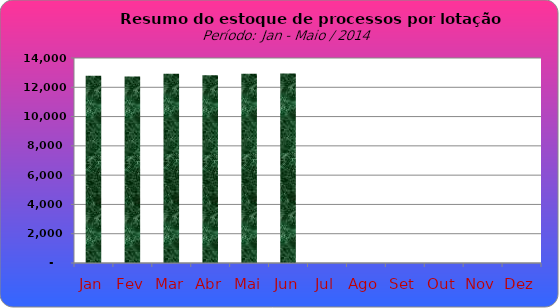
| Category | Series 0 |
|---|---|
| Jan | 12795 |
| Fev | 12744 |
| Mar | 12928 |
| Abr | 12816 |
| Mai | 12923 |
| Jun | 12943 |
| Jul | 0 |
| Ago | 0 |
| Set | 0 |
| Out | 0 |
| Nov | 0 |
| Dez | 0 |